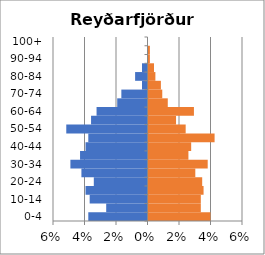
| Category | % Men | % Women |
|---|---|---|
| 0-4 | -0.038 | 0.039 |
| 5-9 | -0.026 | 0.033 |
| 10-14 | -0.037 | 0.033 |
| 15-19 | -0.039 | 0.035 |
| 20-24 | -0.034 | 0.034 |
| 25-29 | -0.042 | 0.03 |
| 30-34 | -0.049 | 0.038 |
| 35-39 | -0.043 | 0.025 |
| 40-44 | -0.039 | 0.027 |
| 45-49 | -0.038 | 0.042 |
| 50-54 | -0.052 | 0.024 |
| 55-59 | -0.036 | 0.017 |
| 60-64 | -0.032 | 0.029 |
| 65-69 | -0.019 | 0.012 |
| 70-74 | -0.017 | 0.009 |
| 75-79 | -0.003 | 0.008 |
| 80-84 | -0.008 | 0.004 |
| 85-89 | -0.003 | 0.003 |
| 90-94 | 0 | 0.001 |
| 95-99 | 0 | 0.001 |
| 100+ | 0 | 0 |